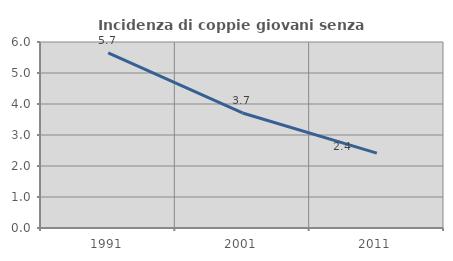
| Category | Incidenza di coppie giovani senza figli |
|---|---|
| 1991.0 | 5.651 |
| 2001.0 | 3.711 |
| 2011.0 | 2.414 |